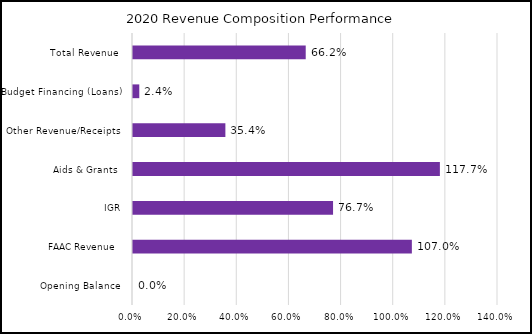
| Category | Series 0 |
|---|---|
| Opening Balance | 0 |
| FAAC Revenue  | 1.07 |
| IGR | 0.767 |
| Aids & Grants  | 1.177 |
| Other Revenue/Receipts | 0.354 |
| Budget Financing (Loans) | 0.024 |
| Total Revenue  | 0.662 |